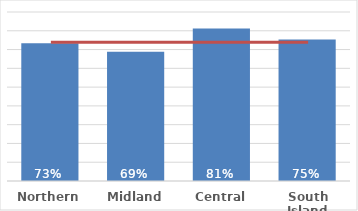
| Category | Dep 5 |
|---|---|
| Northern | 0.734 |
| Midland | 0.689 |
| Central | 0.811 |
| South Island | 0.754 |